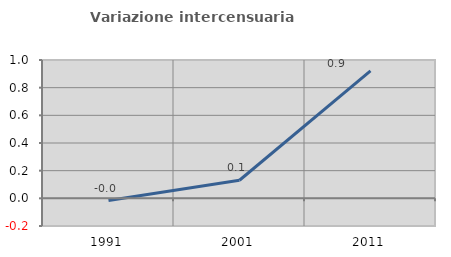
| Category | Variazione intercensuaria annua |
|---|---|
| 1991.0 | -0.016 |
| 2001.0 | 0.131 |
| 2011.0 | 0.921 |